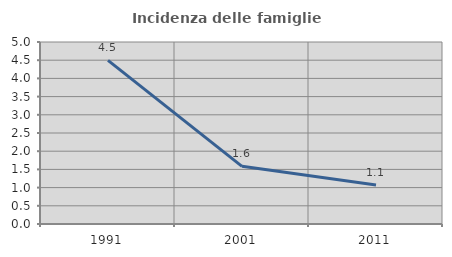
| Category | Incidenza delle famiglie numerose |
|---|---|
| 1991.0 | 4.494 |
| 2001.0 | 1.584 |
| 2011.0 | 1.073 |